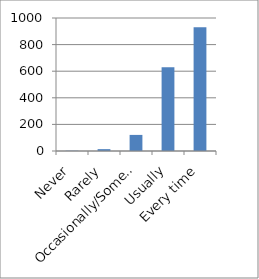
| Category | Series 0 |
|---|---|
| Never | 2 |
| Rarely | 14 |
| Occasionally/Sometimes | 121 |
| Usually | 629 |
| Every time | 931 |